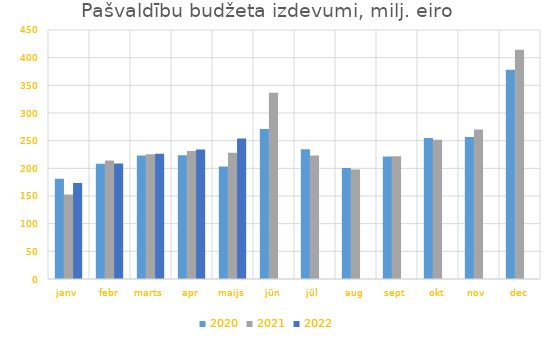
| Category | 2020 | 2021 | 2022 |
|---|---|---|---|
| janv | 181241.02 | 152675.552 | 173548.423 |
| febr | 208405.475 | 213940.448 | 208650.357 |
| marts | 223138.505 | 225624.876 | 226166.321 |
| apr | 223577 | 231146.925 | 234145.666 |
| maijs | 203504.23 | 228193.448 | 253995.943 |
| jūn | 271297.77 | 336561.936 | 0 |
| jūl | 234617.887 | 223275.425 | 0 |
| aug | 200617.365 | 197904.39 | 0 |
| sept | 221574.112 | 221712.162 | 0 |
| okt | 254993.621 | 251718.671 | 0 |
| nov | 256741.926 | 270071.167 | 0 |
| dec | 378007.978 | 414250.751 | 0 |